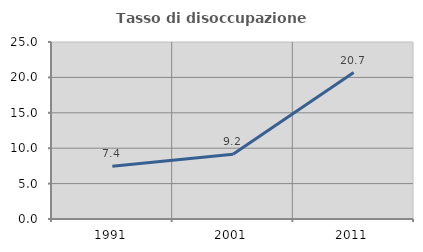
| Category | Tasso di disoccupazione giovanile  |
|---|---|
| 1991.0 | 7.442 |
| 2001.0 | 9.155 |
| 2011.0 | 20.69 |